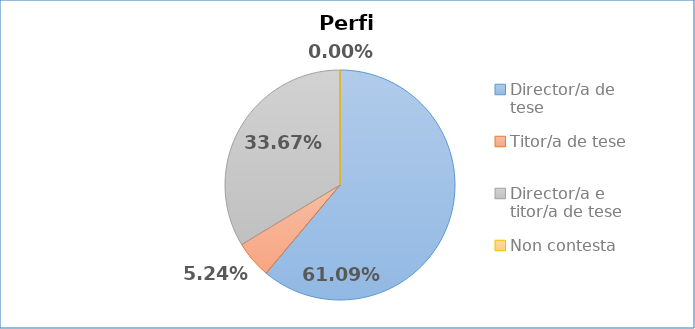
| Category | Perfil |
|---|---|
| Director/a de tese | 0.611 |
| Titor/a de tese | 0.052 |
| Director/a e titor/a de tese | 0.337 |
| Non contesta | 0 |